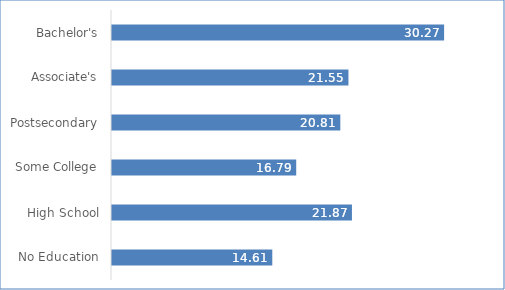
| Category | Series 0 |
|---|---|
| No Education | 14.61 |
| High School | 21.87 |
| Some College | 16.79 |
| Postsecondary | 20.81 |
| Associate's | 21.55 |
| Bachelor's | 30.27 |